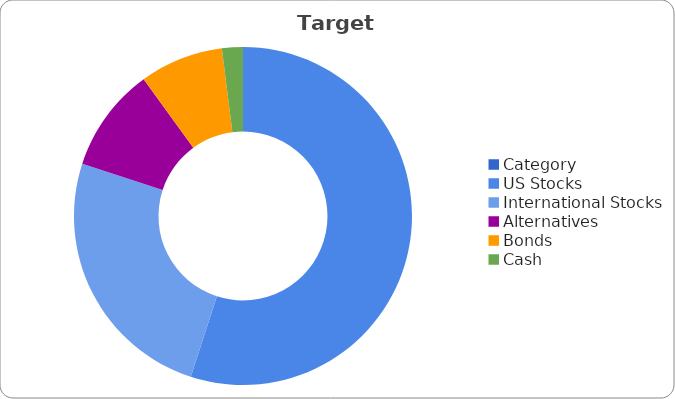
| Category | Series 0 |
|---|---|
| Category | 0 |
| US Stocks | 0.55 |
| International Stocks | 0.25 |
| Alternatives | 0.1 |
| Bonds | 0.08 |
| Cash | 0.02 |